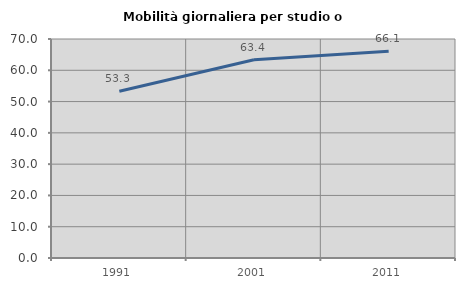
| Category | Mobilità giornaliera per studio o lavoro |
|---|---|
| 1991.0 | 53.318 |
| 2001.0 | 63.387 |
| 2011.0 | 66.119 |